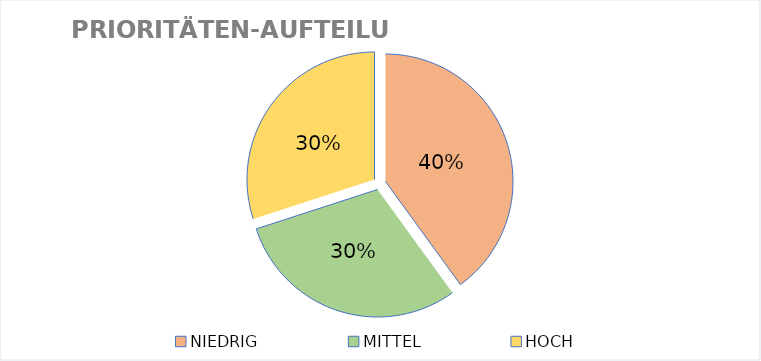
| Category | Series 0 |
|---|---|
| NIEDRIG | 4 |
| MITTEL | 3 |
| HOCH | 3 |